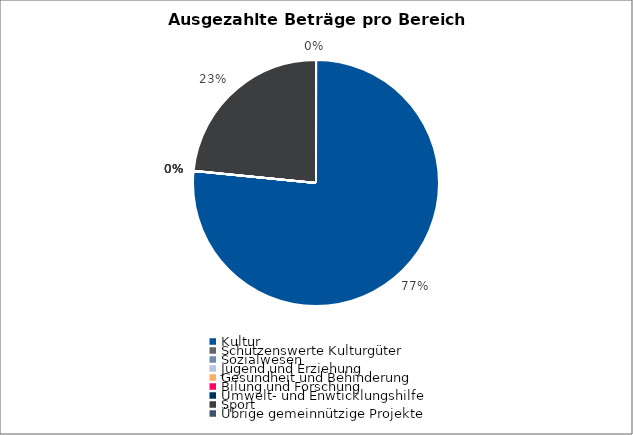
| Category | Series 0 |
|---|---|
| Kultur | 1573869.6 |
| Schützenswerte Kulturgüter | 0 |
| Sozialwesen | 0 |
| Jugend und Erziehung | 0 |
| Gesundheit und Behinderung | 0 |
| Bilung und Forschung | 0 |
| Umwelt- und Enwticklungshilfe | 0 |
| Sport | 481907 |
| Übrige gemeinnützige Projekte | 0 |